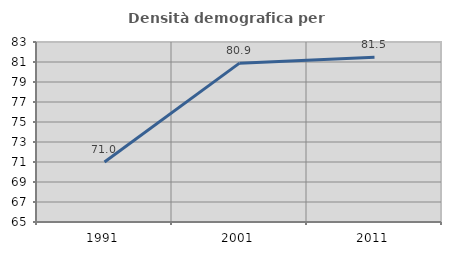
| Category | Densità demografica |
|---|---|
| 1991.0 | 70.995 |
| 2001.0 | 80.884 |
| 2011.0 | 81.475 |